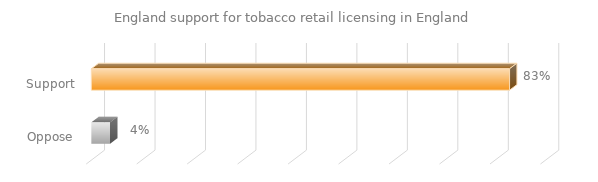
| Category | England support for tobacco retail licensing in England |
|---|---|
| Support | 0.829 |
| Oppose | 0.037 |